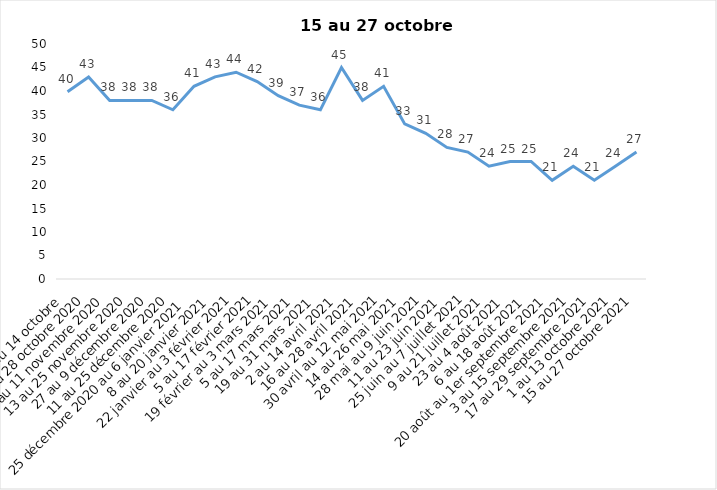
| Category | Toujours aux trois mesures |
|---|---|
| 2 au 14 octobre  | 39.85 |
| 16 au 28 octobre 2020 | 43 |
| 30 octobre au 11 novembre 2020 | 38 |
| 13 au 25 novembre 2020 | 38 |
| 27 au 9 décembre 2020 | 38 |
| 11 au 25 décembre 2020 | 36 |
| 25 décembre 2020 au 6 janvier 2021 | 41 |
| 8 au 20 janvier 2021 | 43 |
| 22 janvier au 3 février 2021 | 44 |
| 5 au 17 février 2021 | 42 |
| 19 février au 3 mars 2021 | 39 |
| 5 au 17 mars 2021 | 37 |
| 19 au 31 mars 2021 | 36 |
| 2 au 14 avril 2021 | 45 |
| 16 au 28 avril 2021 | 38 |
| 30 avril au 12 mai 2021 | 41 |
| 14 au 26 mai 2021 | 33 |
| 28 mai au 9 juin 2021 | 31 |
| 11 au 23 juin 2021 | 28 |
| 25 juin au 7 juillet 2021 | 27 |
| 9 au 21 juillet 2021 | 24 |
| 23 au 4 août 2021 | 25 |
| 6 au 18 août 2021 | 25 |
| 20 août au 1er septembre 2021 | 21 |
| 3 au 15 septembre 2021 | 24 |
| 17 au 29 septembre 2021 | 21 |
| 1 au 13 octobre 2021 | 24 |
| 15 au 27 octobre 2021 | 27 |